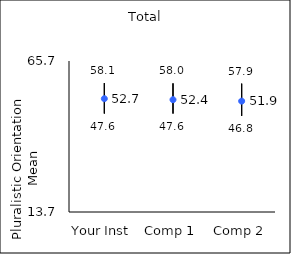
| Category | 25th percentile | 75th percentile | Mean |
|---|---|---|---|
| Your Inst | 47.6 | 58.1 | 52.73 |
| Comp 1 | 47.6 | 58 | 52.38 |
| Comp 2 | 46.8 | 57.9 | 51.88 |